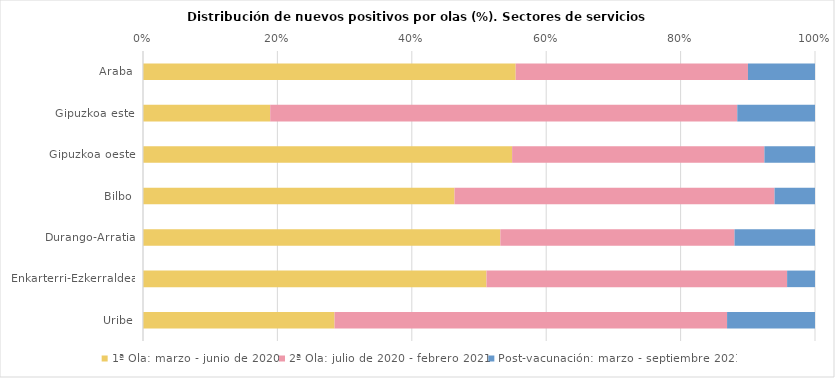
| Category | 1ª Ola: marzo - junio de 2020 | 2ª Ola: julio de 2020 - febrero 2021 | Post-vacunación: marzo - septiembre 2021 |
|---|---|---|---|
| Araba | 55.46 | 34.564 | 9.976 |
| Gipuzkoa este | 18.929 | 69.503 | 11.568 |
| Gipuzkoa oeste | 54.928 | 37.542 | 7.53 |
| Bilbo | 46.356 | 47.623 | 6.021 |
| Durango-Arratia | 53.176 | 34.846 | 11.978 |
| Enkarterri-Ezkerraldea | 51.113 | 44.737 | 4.15 |
| Uribe | 28.505 | 58.411 | 13.084 |